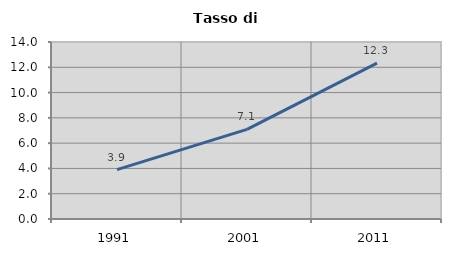
| Category | Tasso di disoccupazione   |
|---|---|
| 1991.0 | 3.906 |
| 2001.0 | 7.092 |
| 2011.0 | 12.322 |